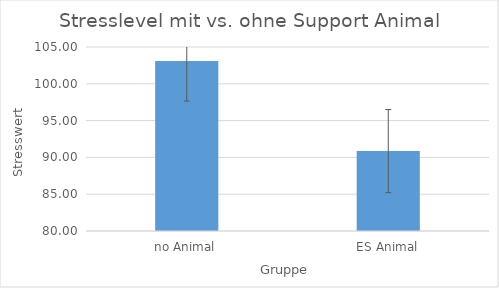
| Category | Mittelwert |
|---|---|
| no Animal | 103.088 |
| ES Animal | 90.853 |